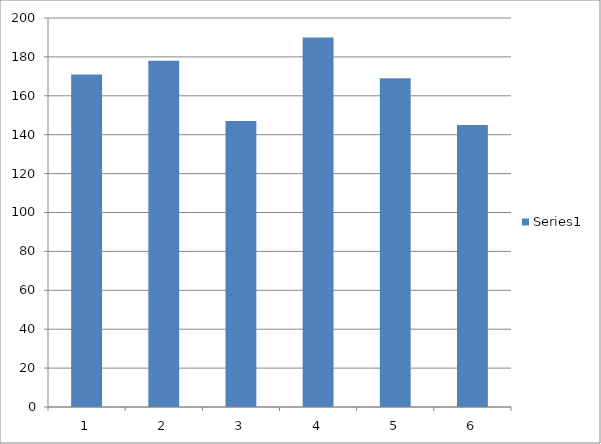
| Category | Series 0 |
|---|---|
| 0 | 171 |
| 1 | 178 |
| 2 | 147 |
| 3 | 190 |
| 4 | 169 |
| 5 | 145 |